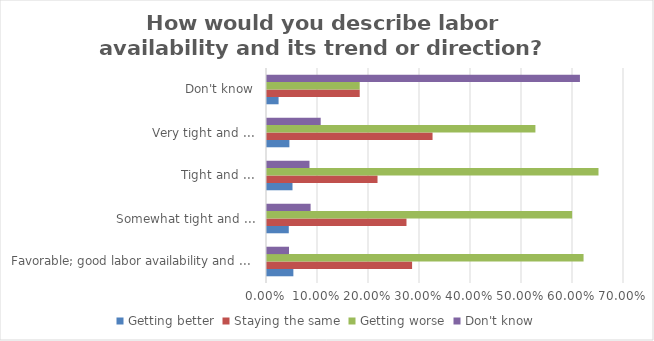
| Category | Getting better | Staying the same | Getting worse | Don't know |
|---|---|---|---|---|
| Favorable; good labor availability and ... | 0.052 | 0.284 | 0.621 | 0.043 |
| Somewhat tight and ... | 0.043 | 0.274 | 0.598 | 0.086 |
| Tight and ... | 0.05 | 0.217 | 0.65 | 0.083 |
| Very tight and ... | 0.044 | 0.325 | 0.526 | 0.105 |
| Don't know | 0.023 | 0.182 | 0.182 | 0.614 |